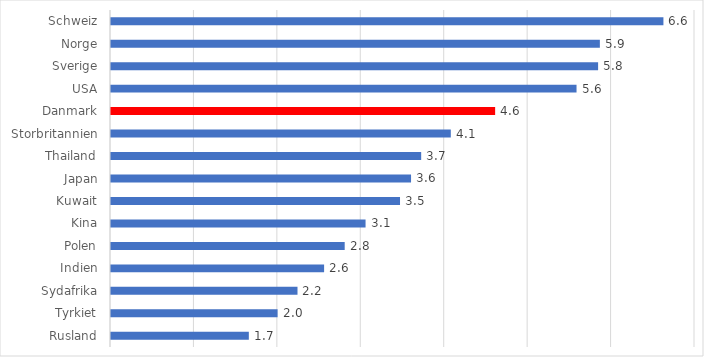
| Category | Series 0 |
|---|---|
| Schweiz | 6.622 |
| Norge | 5.86 |
| Sverige | 5.839 |
| USA | 5.58 |
| Danmark | 4.604 |
| Storbritannien | 4.073 |
| Thailand | 3.718 |
| Japan | 3.596 |
| Kuwait | 3.464 |
| Kina | 3.051 |
| Polen | 2.801 |
| Indien | 2.554 |
| Sydafrika | 2.235 |
| Tyrkiet | 1.997 |
| Rusland | 1.652 |